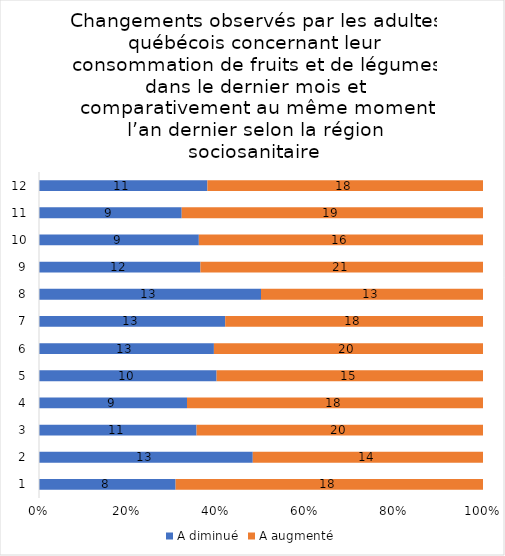
| Category | A diminué | A augmenté |
|---|---|---|
| 0 | 8 | 18 |
| 1 | 13 | 14 |
| 2 | 11 | 20 |
| 3 | 9 | 18 |
| 4 | 10 | 15 |
| 5 | 13 | 20 |
| 6 | 13 | 18 |
| 7 | 13 | 13 |
| 8 | 12 | 21 |
| 9 | 9 | 16 |
| 10 | 9 | 19 |
| 11 | 11 | 18 |